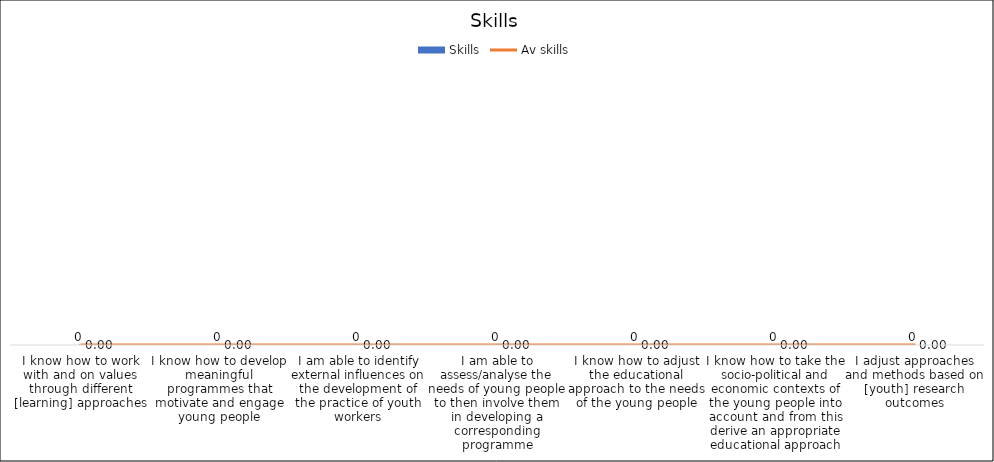
| Category | Skills |
|---|---|
| I know how to work with and on values through different [learning] approaches | 0 |
| I know how to develop meaningful programmes that motivate and engage young people | 0 |
| I am able to identify external influences on the development of the practice of youth workers | 0 |
| I am able to assess/analyse the needs of young people to then involve them in developing a corresponding programme | 0 |
| I know how to adjust the educational approach to the needs of the young people | 0 |
| I know how to take the socio-political and economic contexts of the young people into account and from this derive an appropriate educational approach | 0 |
| I adjust approaches and methods based on [youth] research outcomes | 0 |